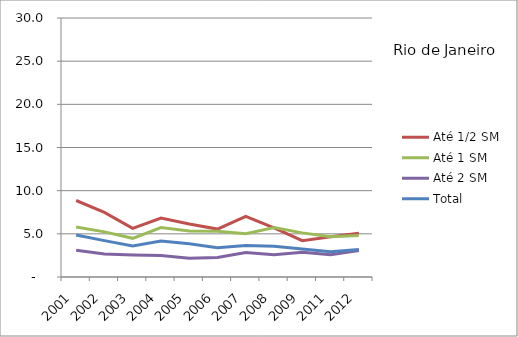
| Category | Até 1/2 SM | Até 1 SM | Até 2 SM | Total |
|---|---|---|---|---|
| 2001.0 | 8.86 | 5.8 | 3.1 | 4.87 |
| 2002.0 | 7.49 | 5.23 | 2.66 | 4.21 |
| 2003.0 | 5.63 | 4.48 | 2.56 | 3.6 |
| 2004.0 | 6.83 | 5.73 | 2.48 | 4.16 |
| 2005.0 | 6.14 | 5.33 | 2.17 | 3.86 |
| 2006.0 | 5.55 | 5.3 | 2.25 | 3.38 |
| 2007.0 | 7.03 | 5 | 2.84 | 3.65 |
| 2008.0 | 5.69 | 5.73 | 2.59 | 3.56 |
| 2009.0 | 4.2 | 5.11 | 2.88 | 3.23 |
| 2011.0 | 4.66 | 4.66 | 2.58 | 2.92 |
| 2012.0 | 5.06 | 4.82 | 3.06 | 3.18 |